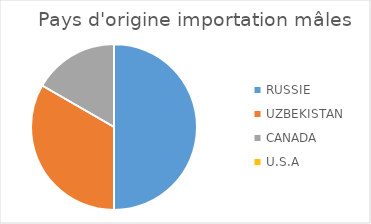
| Category | Series 0 |
|---|---|
| RUSSIE | 3 |
| UZBEKISTAN | 2 |
| CANADA | 1 |
| U.S.A | 0 |